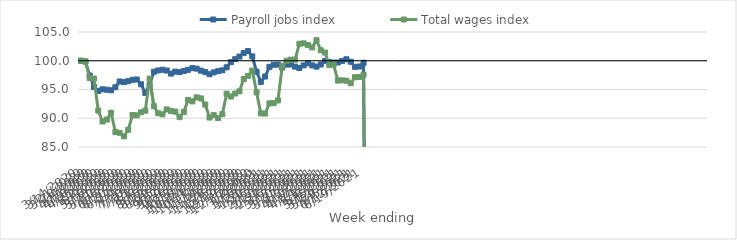
| Category | Payroll jobs index | Total wages index |
|---|---|---|
| 14/03/2020 | 100 | 100 |
| 21/03/2020 | 99.852 | 99.892 |
| 28/03/2020 | 97.444 | 97.007 |
| 04/04/2020 | 95.457 | 96.912 |
| 11/04/2020 | 94.758 | 91.332 |
| 18/04/2020 | 95.035 | 89.43 |
| 25/04/2020 | 94.965 | 89.766 |
| 02/05/2020 | 94.862 | 90.946 |
| 09/05/2020 | 95.398 | 87.613 |
| 16/05/2020 | 96.396 | 87.472 |
| 23/05/2020 | 96.294 | 86.853 |
| 30/05/2020 | 96.444 | 87.992 |
| 06/06/2020 | 96.684 | 90.556 |
| 13/06/2020 | 96.743 | 90.51 |
| 20/06/2020 | 95.92 | 91.037 |
| 27/06/2020 | 94.397 | 91.32 |
| 04/07/2020 | 95.789 | 96.888 |
| 11/07/2020 | 98.089 | 92.102 |
| 18/07/2020 | 98.308 | 90.864 |
| 25/07/2020 | 98.432 | 90.676 |
| 01/08/2020 | 98.294 | 91.544 |
| 08/08/2020 | 97.765 | 91.271 |
| 15/08/2020 | 98.104 | 91.159 |
| 22/08/2020 | 98.026 | 90.19 |
| 29/08/2020 | 98.228 | 91.11 |
| 05/09/2020 | 98.421 | 93.188 |
| 12/09/2020 | 98.722 | 92.94 |
| 19/09/2020 | 98.63 | 93.626 |
| 26/09/2020 | 98.277 | 93.457 |
| 03/10/2020 | 98.022 | 92.38 |
| 10/10/2020 | 97.656 | 90.123 |
| 17/10/2020 | 97.974 | 90.54 |
| 24/10/2020 | 98.198 | 90.044 |
| 31/10/2020 | 98.332 | 90.713 |
| 07/11/2020 | 98.856 | 94.265 |
| 14/11/2020 | 99.763 | 93.785 |
| 21/11/2020 | 100.282 | 94.3 |
| 28/11/2020 | 100.723 | 94.692 |
| 05/12/2020 | 101.36 | 96.822 |
| 12/12/2020 | 101.686 | 97.368 |
| 19/12/2020 | 100.757 | 98.286 |
| 26/12/2020 | 98.1 | 94.501 |
| 02/01/2021 | 96.321 | 90.839 |
| 09/01/2021 | 97.257 | 90.816 |
| 16/01/2021 | 98.939 | 92.587 |
| 23/01/2021 | 99.305 | 92.624 |
| 30/01/2021 | 99.334 | 93.102 |
| 06/02/2021 | 98.826 | 99.054 |
| 13/02/2021 | 99.335 | 100.002 |
| 20/02/2021 | 99.35 | 100.188 |
| 27/02/2021 | 98.975 | 100.188 |
| 06/03/2021 | 98.734 | 102.947 |
| 13/03/2021 | 99.191 | 103.02 |
| 20/03/2021 | 99.565 | 102.724 |
| 27/03/2021 | 99.194 | 102.312 |
| 03/04/2021 | 98.978 | 103.558 |
| 10/04/2021 | 99.349 | 101.827 |
| 17/04/2021 | 99.975 | 101.428 |
| 24/04/2021 | 99.756 | 99.262 |
| 01/05/2021 | 99.679 | 99.362 |
| 08/05/2021 | 99.7 | 96.539 |
| 15/05/2021 | 99.971 | 96.592 |
| 22/05/2021 | 100.257 | 96.52 |
| 29/05/2021 | 99.832 | 96.086 |
| 05/06/2021 | 98.937 | 97.137 |
| 12/06/2021 | 98.994 | 97.179 |
| 19/06/2021 | 99.649 | 97.601 |